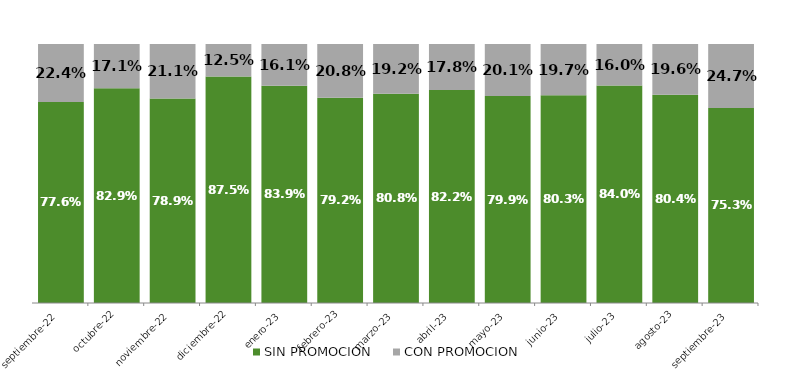
| Category | SIN PROMOCION   | CON PROMOCION   |
|---|---|---|
| 2022-09-01 | 0.776 | 0.224 |
| 2022-10-01 | 0.829 | 0.171 |
| 2022-11-01 | 0.789 | 0.211 |
| 2022-12-01 | 0.875 | 0.125 |
| 2023-01-01 | 0.839 | 0.161 |
| 2023-02-01 | 0.792 | 0.208 |
| 2023-03-01 | 0.808 | 0.192 |
| 2023-04-01 | 0.822 | 0.178 |
| 2023-05-01 | 0.799 | 0.201 |
| 2023-06-01 | 0.803 | 0.197 |
| 2023-07-01 | 0.84 | 0.16 |
| 2023-08-01 | 0.804 | 0.196 |
| 2023-09-01 | 0.753 | 0.247 |